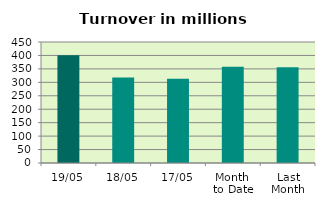
| Category | Series 0 |
|---|---|
| 19/05 | 400.828 |
| 18/05 | 318.111 |
| 17/05 | 312.999 |
| Month 
to Date | 358.025 |
| Last
Month | 356.105 |